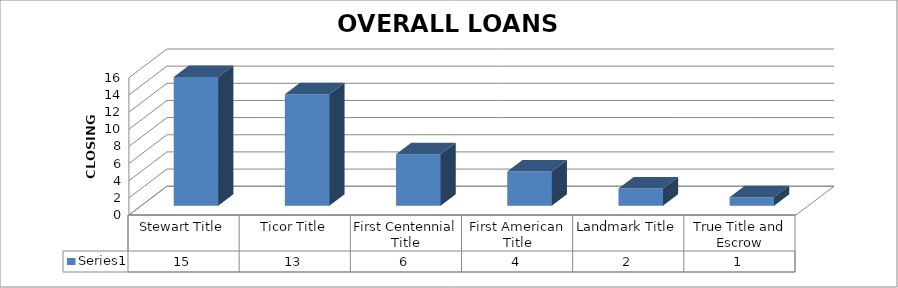
| Category | Series 0 |
|---|---|
| Stewart Title | 15 |
| Ticor Title | 13 |
| First Centennial Title | 6 |
| First American Title | 4 |
| Landmark Title | 2 |
| True Title and Escrow | 1 |